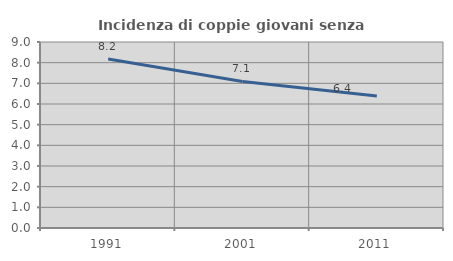
| Category | Incidenza di coppie giovani senza figli |
|---|---|
| 1991.0 | 8.181 |
| 2001.0 | 7.089 |
| 2011.0 | 6.39 |